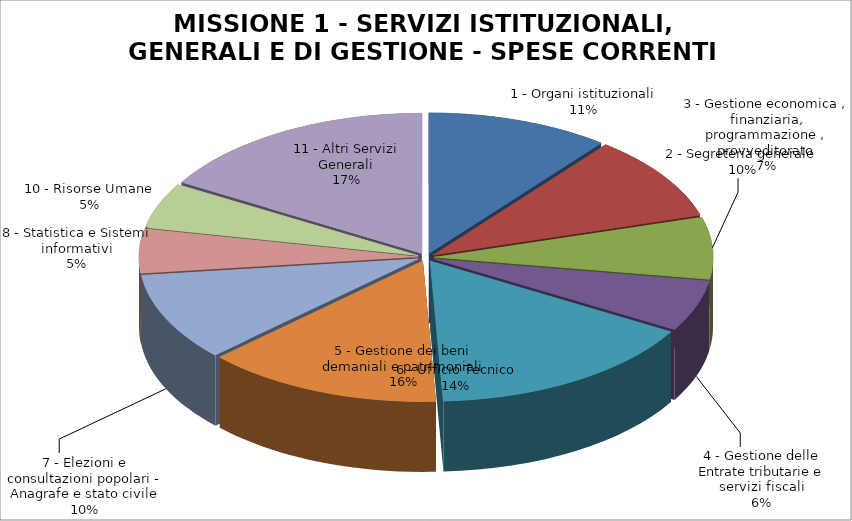
| Category | Previsione Iniziale Competenza |
|---|---|
| 1 - Organi istituzionali | 688510 |
| 2 - Segreteria generale | 635170 |
| 3 - Gestione economica , finanziaria, programmazione , provveditorato | 462186 |
| 4 - Gestione delle Entrate tributarie e servizi fiscali | 381863 |
| 5 - Gestione dei beni demaniali e patrimoniali | 1028155 |
| 6 - Ufficio Tecnico | 891509 |
| 7 - Elezioni e consultazioni popolari - Anagrafe e stato civile | 657325 |
| 8 - Statistica e Sistemi informativi | 329259 |
| 10 - Risorse Umane | 340865 |
| 11 - Altri Servizi Generali | 1073946 |